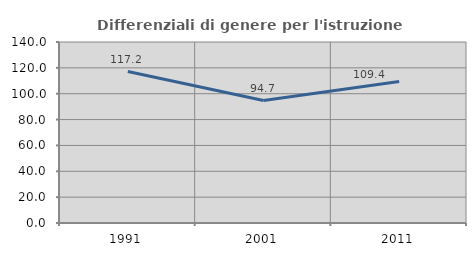
| Category | Differenziali di genere per l'istruzione superiore |
|---|---|
| 1991.0 | 117.157 |
| 2001.0 | 94.683 |
| 2011.0 | 109.384 |